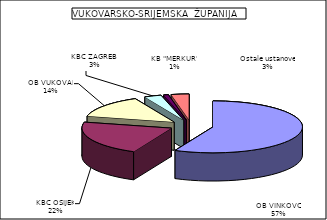
| Category | Series 0 |
|---|---|
| OB VINKOVCI | 56.965 |
| KBC OSIJEK | 21.75 |
| OB VUKOVAR | 14.124 |
| KBC ZAGREB  | 3.057 |
| KB "MERKUR" | 0.877 |
| Ostale ustanove | 3.228 |